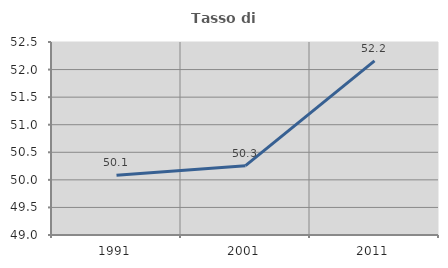
| Category | Tasso di occupazione   |
|---|---|
| 1991.0 | 50.082 |
| 2001.0 | 50.257 |
| 2011.0 | 52.157 |